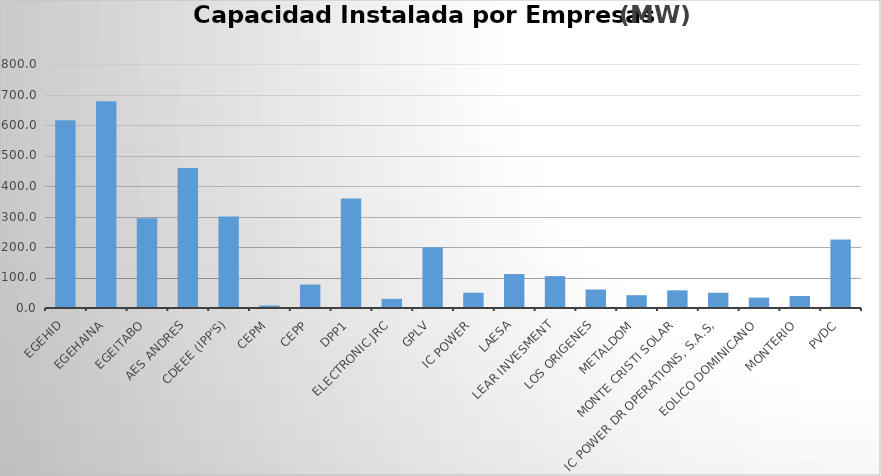
| Category | Potencia     (MW) |
|---|---|
| EGEHID | 615.52 |
| EGEHAINA | 678.21 |
| EGEITABO | 294.5 |
| AES ANDRES | 459 |
| CDEEE (IPP's) | 300 |
| CEPM | 8.25 |
| CEPP | 76.8 |
| DPP1 | 359.3 |
| ELECTRONIC JRC | 30 |
| GPLV | 199 |
| IC POWER | 50 |
| LAESA | 111.2 |
| LEAR INVESMENT | 104.52 |
| LOS ORIGENES | 60.69 |
| METALDOM | 42 |
| MONTE CRISTI SOLAR | 57.96 |
| IC POWER DR OPERATIONS, S.A.S, | 50 |
| EOLICO DOMINICANO | 34 |
| MONTERIO | 39.4 |
| PVDC | 225 |